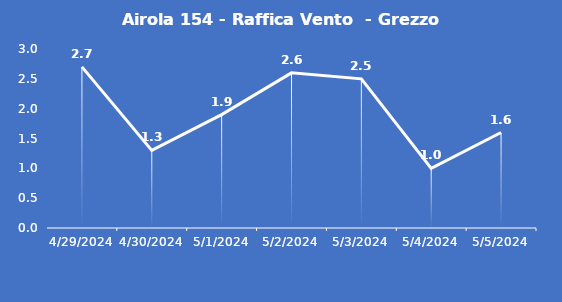
| Category | Airola 154 - Raffica Vento  - Grezzo (m/s) |
|---|---|
| 4/29/24 | 2.7 |
| 4/30/24 | 1.3 |
| 5/1/24 | 1.9 |
| 5/2/24 | 2.6 |
| 5/3/24 | 2.5 |
| 5/4/24 | 1 |
| 5/5/24 | 1.6 |